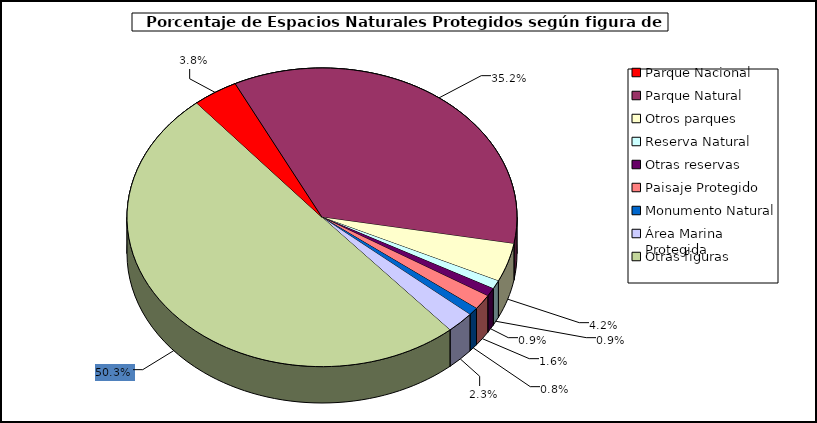
| Category | Parque Nacional Parque Natural Otros parques Reserva Natural Otras reservas Paisaje Protegido Monumento Natural Área Marina Protegida Otras figuras |
|---|---|
| Parque Nacional | 3.761 |
| Parque Natural | 35.19 |
| Otros parques | 4.175 |
| Reserva Natural | 0.92 |
| Otras reservas | 0.894 |
| Paisaje Protegido | 1.616 |
| Monumento Natural | 0.849 |
| Área Marina Protegida | 2.315 |
| Otras figuras | 50.279 |